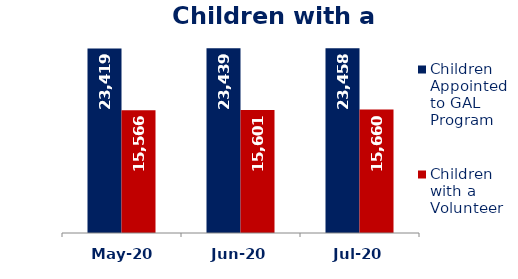
| Category | Children Appointed to GAL Program  | Children with a Volunteer  |
|---|---|---|
| May-20 | 23419 | 15566 |
| Jun-20 | 23439 | 15601 |
| Jul-20 | 23458 | 15660 |